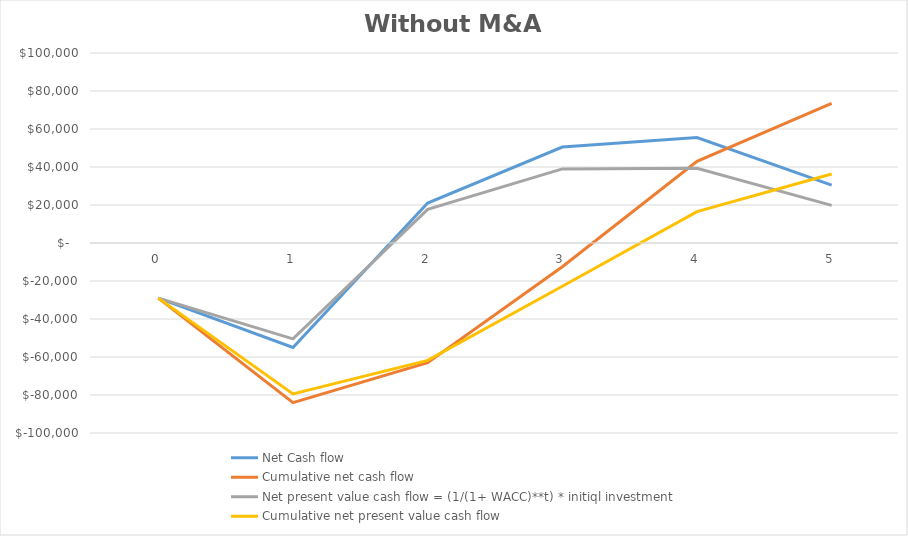
| Category | Net Cash flow | Cumulative net cash flow | Net present value cash flow = (1/(1+ WACC)**t) * initiql investment | Cumulative net present value cash flow |
|---|---|---|---|---|
| 0.0 | -29000 | -29000 | -29000 | -29000 |
| 1.0 | -55000 | -84000 | -50458.716 | -79458.716 |
| 2.0 | 21000 | -63000 | 17675.28 | -61783.436 |
| 3.0 | 50500 | -12500 | 38995.266 | -22788.17 |
| 4.0 | 55500 | 43000 | 39317.599 | 16529.429 |
| 5.0 | 30500 | 73500 | 19822.907 | 36352.337 |